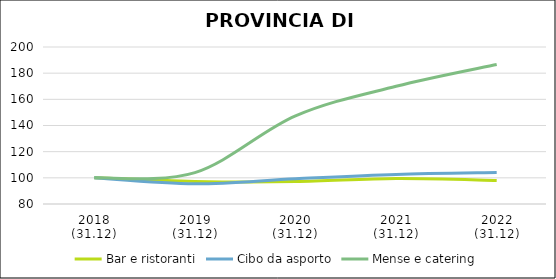
| Category | Bar e ristoranti | Cibo da asporto | Mense e catering |
|---|---|---|---|
| 2018
(31.12) | 100 | 100 | 100 |
| 2019
(31.12) | 97.264 | 95.462 | 104 |
| 2020
(31.12) | 97.131 | 99.302 | 147.333 |
| 2021
(31.12) | 99.444 | 102.618 | 170 |
| 2022
(31.12) | 98.02 | 104.014 | 186.667 |